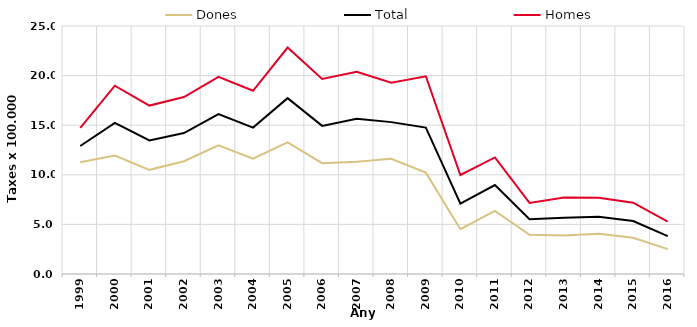
| Category | Dones | Total | Homes |
|---|---|---|---|
| 1999.0 | 11.27 | 12.9 | 14.74 |
| 2000.0 | 11.94 | 15.23 | 18.98 |
| 2001.0 | 10.5 | 13.46 | 16.98 |
| 2002.0 | 11.37 | 14.21 | 17.84 |
| 2003.0 | 12.98 | 16.11 | 19.87 |
| 2004.0 | 11.62 | 14.76 | 18.47 |
| 2005.0 | 13.26 | 17.73 | 22.83 |
| 2006.0 | 11.17 | 14.93 | 19.67 |
| 2007.0 | 11.31 | 15.65 | 20.38 |
| 2008.0 | 11.61 | 15.31 | 19.29 |
| 2009.0 | 10.22 | 14.76 | 19.93 |
| 2010.0 | 4.52 | 7.1 | 9.98 |
| 2011.0 | 6.36 | 8.97 | 11.75 |
| 2012.0 | 3.96 | 5.53 | 7.17 |
| 2013.0 | 3.89 | 5.66 | 7.7 |
| 2014.0 | 4.06 | 5.77 | 7.68 |
| 2015.0 | 3.66 | 5.34 | 7.19 |
| 2016.0 | 2.51 | 3.81 | 5.27 |